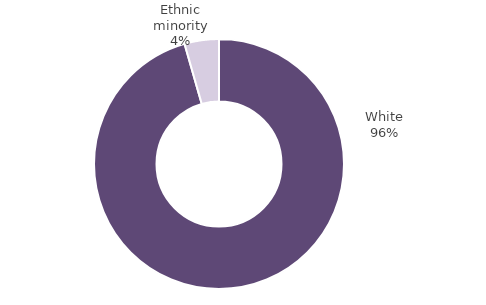
| Category | Series 0 |
|---|---|
| White | 0.956 |
| Ethnic minority | 0.044 |